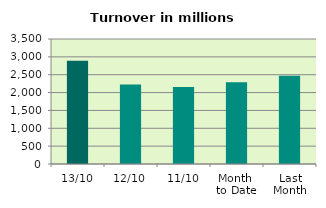
| Category | Series 0 |
|---|---|
| 13/10 | 2892.417 |
| 12/10 | 2229.148 |
| 11/10 | 2157.044 |
| Month 
to Date | 2291.158 |
| Last
Month | 2468.023 |